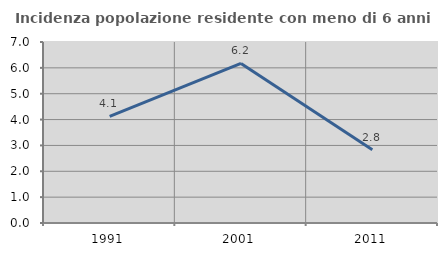
| Category | Incidenza popolazione residente con meno di 6 anni |
|---|---|
| 1991.0 | 4.124 |
| 2001.0 | 6.173 |
| 2011.0 | 2.83 |